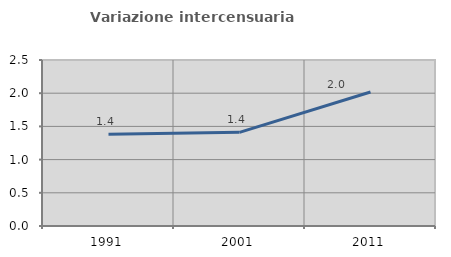
| Category | Variazione intercensuaria annua |
|---|---|
| 1991.0 | 1.383 |
| 2001.0 | 1.41 |
| 2011.0 | 2.018 |